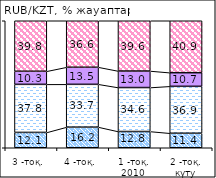
| Category | повысится | не изменится | снизится | білмеймін |
|---|---|---|---|---|
| 3 -тоқ. | 12.08 | 37.84 | 10.32 | 39.76 |
| 4 -тоқ. | 16.21 | 33.73 | 13.45 | 36.6 |
| 1 -тоқ. 2010  | 12.79 | 34.62 | 13 | 39.59 |
| 2 -тоқ. күту | 11.42 | 36.94 | 10.73 | 40.9 |